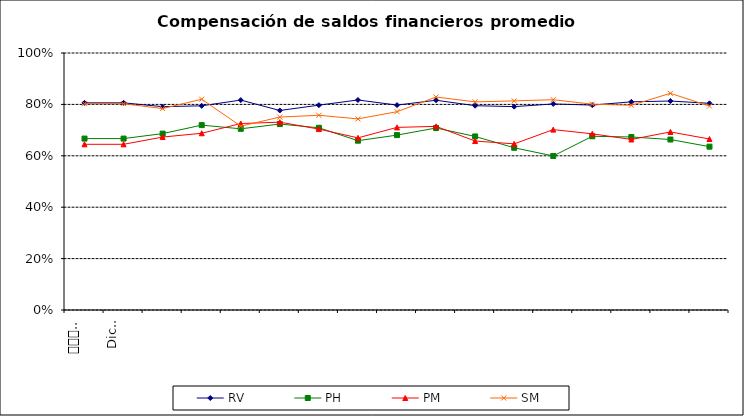
| Category | RV | PH | PM | SM |
|---|---|---|---|---|
| 0 | 0.806 | 0.667 | 0.645 | 0.803 |
| 1 | 0.806 | 0.667 | 0.645 | 0.803 |
| 2 | 0.791 | 0.686 | 0.673 | 0.784 |
| 3 | 0.794 | 0.719 | 0.688 | 0.82 |
| 4 | 0.817 | 0.705 | 0.726 | 0.715 |
| 5 | 0.776 | 0.724 | 0.731 | 0.751 |
| 6 | 0.797 | 0.709 | 0.704 | 0.758 |
| 7 | 0.817 | 0.659 | 0.67 | 0.744 |
| 8 | 0.797 | 0.681 | 0.711 | 0.772 |
| 9 | 0.816 | 0.708 | 0.715 | 0.829 |
| 10 | 0.795 | 0.675 | 0.657 | 0.81 |
| 11 | 0.791 | 0.631 | 0.646 | 0.814 |
| 12 | 0.802 | 0.599 | 0.702 | 0.818 |
| 13 | 0.797 | 0.676 | 0.686 | 0.801 |
| 14 | 0.81 | 0.673 | 0.664 | 0.797 |
| 15 | 0.813 | 0.663 | 0.693 | 0.843 |
| 16 | 0.804 | 0.636 | 0.665 | 0.794 |